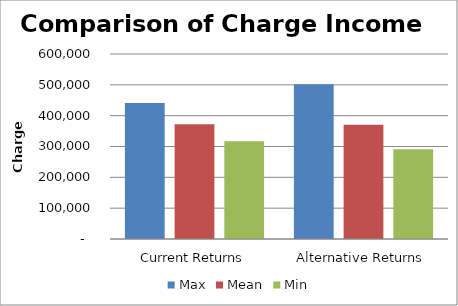
| Category | Max | Mean | Min |
|---|---|---|---|
| Current Returns | 441008.489 | 372193.281 | 316680.906 |
| Alternative Returns | 501773.409 | 370444.183 | 290861.562 |